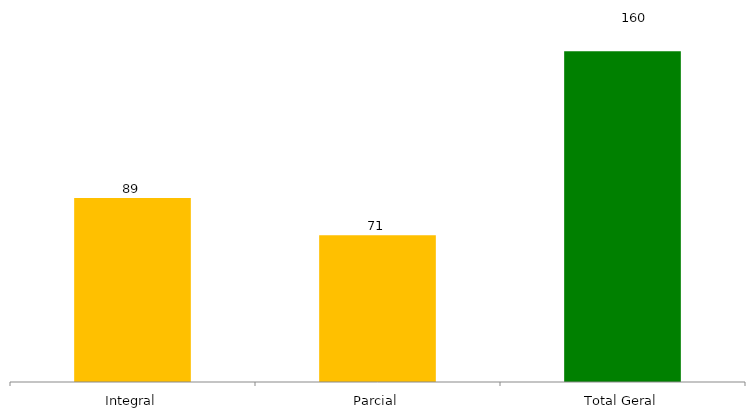
| Category | Categoria/Ano |
|---|---|
| Integral | 89 |
| Parcial | 71 |
| Total Geral | 160 |